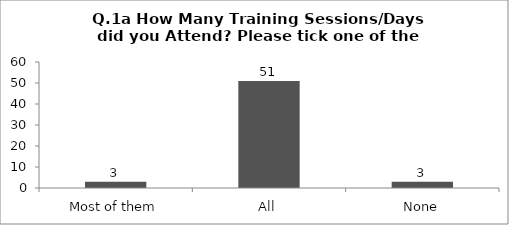
| Category | Q.1a How Many Training Sessions/Days did you Attend? Please tick one of the answers below |
|---|---|
| Most of them | 3 |
| All | 51 |
| None | 3 |